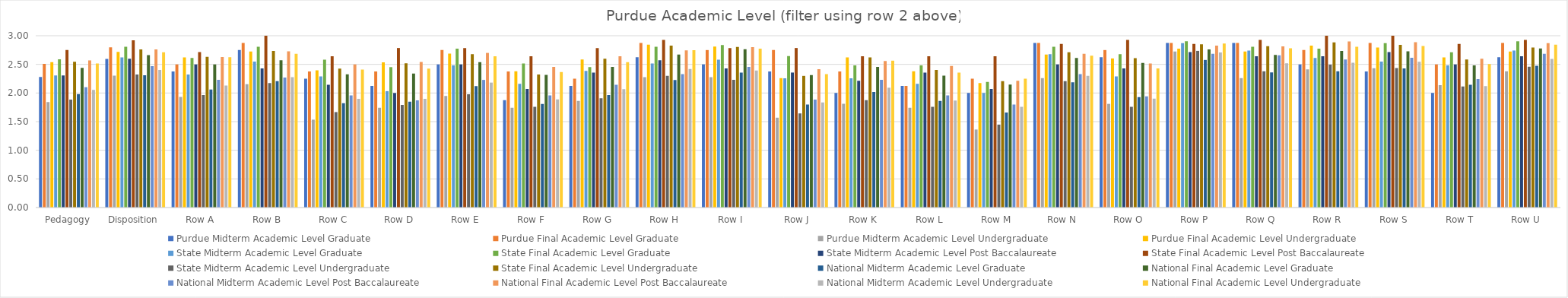
| Category | Purdue | State | National |
|---|---|---|---|
| Pedagogy | 2.54 | 2.544 | 2.516 |
| Disposition | 2.718 | 2.761 | 2.713 |
| Row A | 2.621 | 2.632 | 2.624 |
| Row B | 2.724 | 2.736 | 2.684 |
| Row C | 2.397 | 2.425 | 2.41 |
| Row D | 2.534 | 2.517 | 2.426 |
| Row E | 2.69 | 2.678 | 2.641 |
| Row F | 2.379 | 2.322 | 2.366 |
| Row G | 2.586 | 2.598 | 2.537 |
| Row H | 2.845 | 2.828 | 2.746 |
| Row I | 2.81 | 2.805 | 2.775 |
| Row J | 2.259 | 2.299 | 2.331 |
| Row K | 2.621 | 2.621 | 2.564 |
| Row L | 2.379 | 2.402 | 2.356 |
| Row M | 2.172 | 2.207 | 2.25 |
| Row N | 2.672 | 2.713 | 2.651 |
| Row O | 2.603 | 2.609 | 2.43 |
| Row P | 2.776 | 2.851 | 2.863 |
| Row Q | 2.724 | 2.816 | 2.78 |
| Row R | 2.828 | 2.885 | 2.808 |
| Row S | 2.793 | 2.839 | 2.821 |
| Row T | 2.621 | 2.586 | 2.506 |
| Row U | 2.724 | 2.793 | 2.844 |